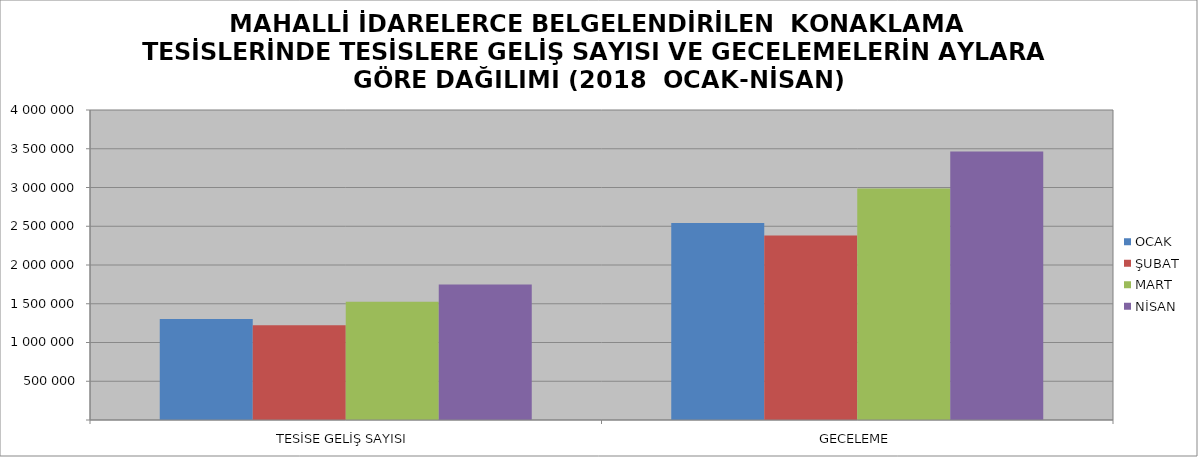
| Category | OCAK | ŞUBAT | MART | NİSAN |
|---|---|---|---|---|
| TESİSE GELİŞ SAYISI | 1303353 | 1223475 | 1526172 | 1749085 |
| GECELEME | 2542103 | 2381300 | 2986820 | 3463261 |